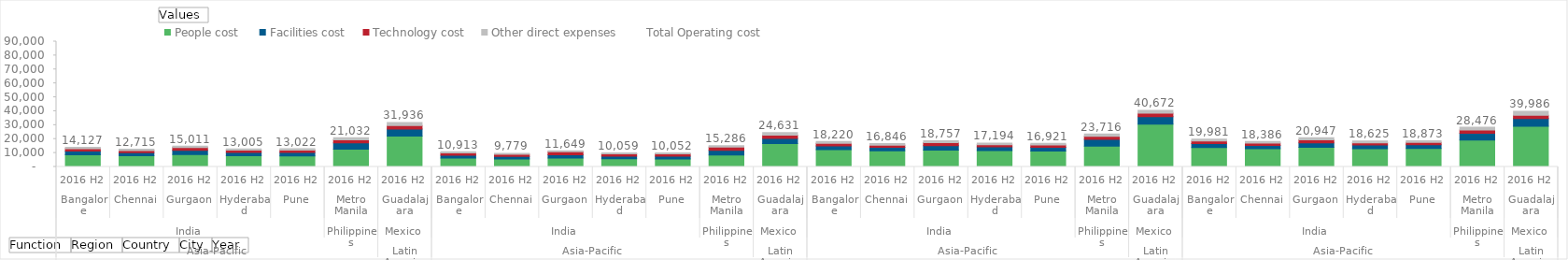
| Category | People cost   | Facilities cost  | Technology cost  | Other direct expenses   | Total Operating cost   |
|---|---|---|---|---|---|
| 0 | 8754.676 | 2622.764 | 1760.443 | 988.873 | 14126.756 |
| 1 | 7993.658 | 2211.821 | 1619.608 | 890.06 | 12715.147 |
| 2 | 8862.025 | 2986.081 | 2112.532 | 1050.801 | 15011.439 |
| 3 | 8075.141 | 2400.137 | 1619.608 | 910.368 | 13005.254 |
| 4 | 7971.381 | 2466.922 | 1672.421 | 911.56 | 13022.284 |
| 5 | 12820.494 | 4489.615 | 2250 | 1472.266 | 21032.375 |
| 6 | 22233.058 | 4967.375 | 2500 | 2235.517 | 31935.95 |
| 7 | 6350.814 | 2037.674 | 1760.443 | 763.898 | 10912.829 |
| 8 | 5774.25 | 1700.693 | 1619.608 | 684.536 | 9779.086 |
| 9 | 6447.528 | 2273.451 | 2112.532 | 815.426 | 11648.937 |
| 10 | 5850.416 | 1885.118 | 1619.608 | 704.15 | 10059.291 |
| 11 | 5752.203 | 1923.792 | 1672.421 | 703.644 | 10052.06 |
| 12 | 8518.762 | 3447.05 | 2250 | 1070.007 | 15285.819 |
| 13 | 16732.919 | 3674.127 | 2500 | 1724.186 | 24631.232 |
| 14 | 12358.851 | 2825.041 | 1760.443 | 1275.38 | 18219.715 |
| 15 | 11659.042 | 2388.298 | 1619.608 | 1179.233 | 16846.181 |
| 16 | 12099.928 | 3231.848 | 2112.532 | 1313.012 | 18757.32 |
| 17 | 11792.266 | 2578.453 | 1619.608 | 1203.573 | 17193.9 |
| 18 | 11409.728 | 2654.786 | 1672.421 | 1184.5 | 16921.435 |
| 19 | 14956.108 | 4849.517 | 2250 | 1660.101 | 23715.726 |
| 20 | 30726.472 | 5412.076 | 2500 | 2033.608 | 40672.156 |
| 21 | 13997.08 | 2825.041 | 1760.443 | 1398.688 | 19981.252 |
| 22 | 13090.823 | 2388.298 | 1619.608 | 1287.001 | 18385.73 |
| 23 | 14136.341 | 3231.848 | 2112.532 | 1466.291 | 20947.011 |
| 24 | 13123.569 | 2578.453 | 1619.608 | 1303.779 | 18625.408 |
| 25 | 13224.327 | 2654.786 | 1672.421 | 1321.083 | 18872.617 |
| 26 | 19383.55 | 4849.517 | 2250 | 1993.349 | 28476.416 |
| 27 | 29274.539 | 5412.076 | 2500 | 2798.993 | 39985.608 |